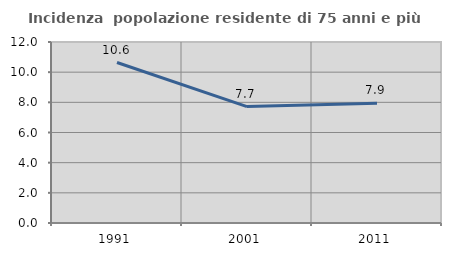
| Category | Incidenza  popolazione residente di 75 anni e più |
|---|---|
| 1991.0 | 10.638 |
| 2001.0 | 7.721 |
| 2011.0 | 7.931 |